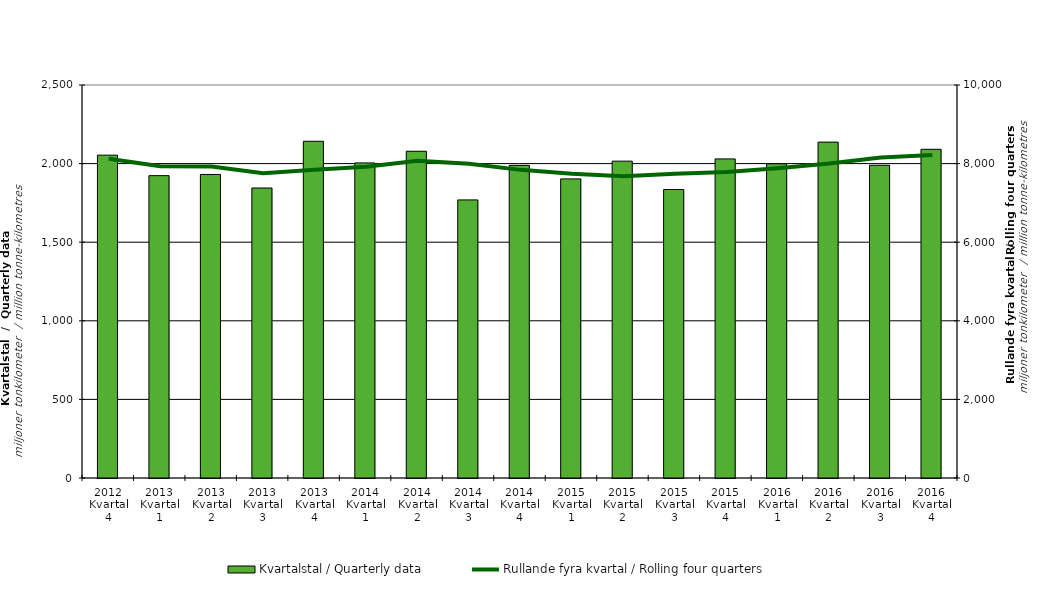
| Category | Kvartalstal / Quarterly data |
|---|---|
| 2012 Kvartal 4 | 2053.722 |
| 2013 Kvartal 1 | 1923.402 |
| 2013 Kvartal 2 | 1931.023 |
| 2013 Kvartal 3 | 1844.768 |
| 2013 Kvartal 4 | 2142.032 |
| 2014 Kvartal 1 | 2004.251 |
| 2014 Kvartal 2 | 2078.529 |
| 2014 Kvartal 3 | 1768.998 |
| 2014 Kvartal 4 | 1988.83 |
| 2015 Kvartal 1 | 1902.765 |
| 2015 Kvartal 2 | 2015.57 |
| 2015 Kvartal 3 | 1835.225 |
| 2015 Kvartal 4 | 2029.823 |
| 2016 Kvartal 1 | 1999.097 |
| 2016 Kvartal 2 | 2136.615 |
| 2016 Kvartal 3 | 1989.4 |
| 2016 Kvartal 4 | 2090.998 |